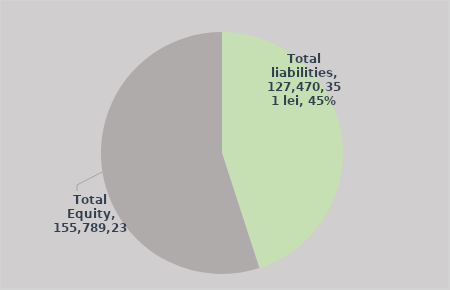
| Category | Series 0 |
|---|---|
| Total liabilities | 127470351 |
| Total Equity | 155789238.578 |